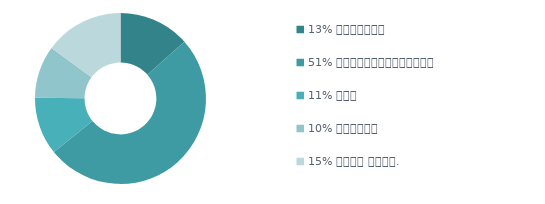
| Category | Series 0 |
|---|---|
| 13% प्रोटीन | 915 |
| 51% कार्बोहाइड्रेट | 3460 |
| 11% वसा | 745 |
| 10% शर्करा | 675 |
| 15% पानी आउंस. | 1018 |